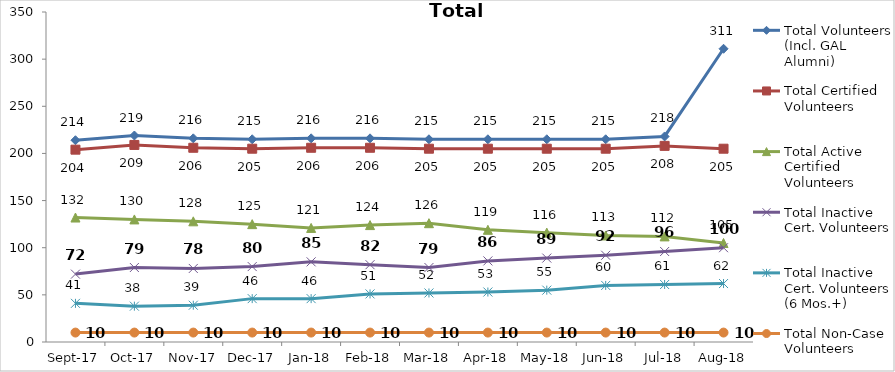
| Category | Total Volunteers (Incl. GAL Alumni) | Total Certified Volunteers | Total Active Certified Volunteers | Total Inactive Cert. Volunteers | Total Inactive Cert. Volunteers (6 Mos.+) | Total Non-Case Volunteers |
|---|---|---|---|---|---|---|
| 2017-09-01 | 214 | 204 | 132 | 72 | 41 | 10 |
| 2017-10-01 | 219 | 209 | 130 | 79 | 38 | 10 |
| 2017-11-01 | 216 | 206 | 128 | 78 | 39 | 10 |
| 2017-12-01 | 215 | 205 | 125 | 80 | 46 | 10 |
| 2018-01-01 | 216 | 206 | 121 | 85 | 46 | 10 |
| 2018-02-01 | 216 | 206 | 124 | 82 | 51 | 10 |
| 2018-03-01 | 215 | 205 | 126 | 79 | 52 | 10 |
| 2018-04-01 | 215 | 205 | 119 | 86 | 53 | 10 |
| 2018-05-01 | 215 | 205 | 116 | 89 | 55 | 10 |
| 2018-06-01 | 215 | 205 | 113 | 92 | 60 | 10 |
| 2018-07-01 | 218 | 208 | 112 | 96 | 61 | 10 |
| 2018-08-01 | 311 | 205 | 105 | 100 | 62 | 10 |